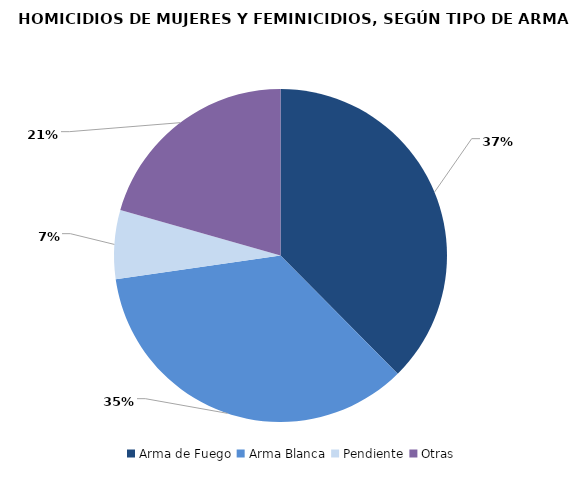
| Category | Series 0 |
|---|---|
| Arma de Fuego | 62 |
| Arma Blanca | 58 |
| Pendiente | 11 |
| Otras | 34 |